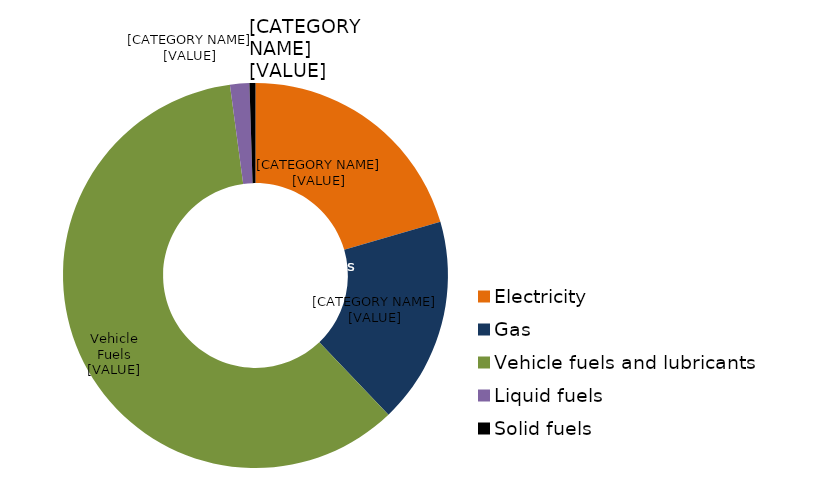
| Category | Series 0 |
|---|---|
| Electricity | 0.205 |
| Gas | 0.174 |
| Vehicle fuels and lubricants  | 0.6 |
| Liquid fuels | 0.016 |
| Solid fuels | 0.005 |